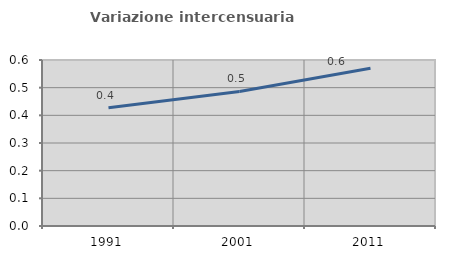
| Category | Variazione intercensuaria annua |
|---|---|
| 1991.0 | 0.428 |
| 2001.0 | 0.486 |
| 2011.0 | 0.57 |